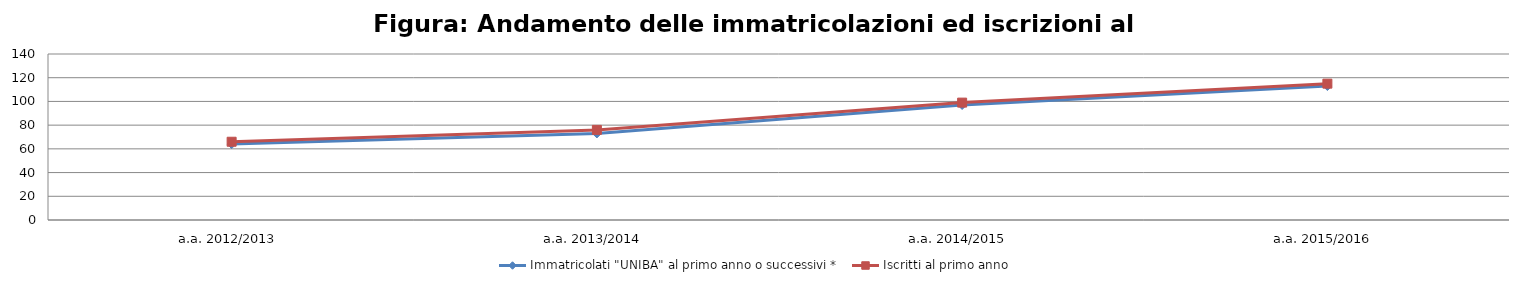
| Category | Immatricolati "UNIBA" al primo anno o successivi * | Iscritti al primo anno  |
|---|---|---|
| a.a. 2012/2013 | 64 | 66 |
| a.a. 2013/2014 | 73 | 76 |
| a.a. 2014/2015 | 97 | 99 |
| a.a. 2015/2016 | 113 | 115 |